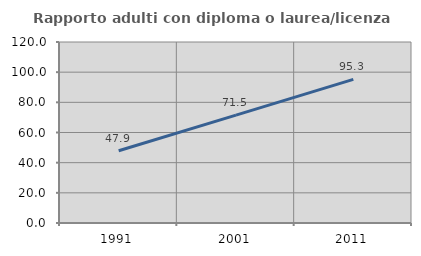
| Category | Rapporto adulti con diploma o laurea/licenza media  |
|---|---|
| 1991.0 | 47.862 |
| 2001.0 | 71.521 |
| 2011.0 | 95.259 |